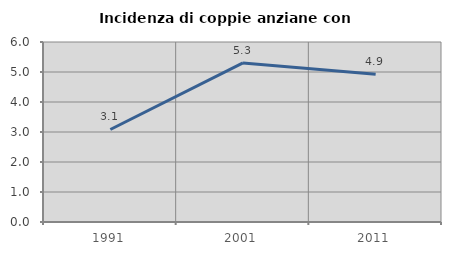
| Category | Incidenza di coppie anziane con figli |
|---|---|
| 1991.0 | 3.084 |
| 2001.0 | 5.303 |
| 2011.0 | 4.924 |